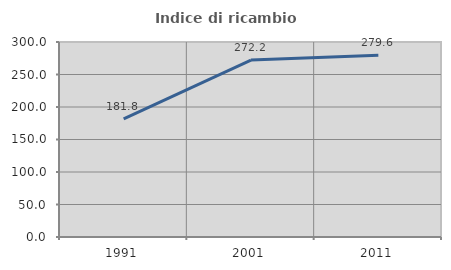
| Category | Indice di ricambio occupazionale  |
|---|---|
| 1991.0 | 181.818 |
| 2001.0 | 272.222 |
| 2011.0 | 279.592 |